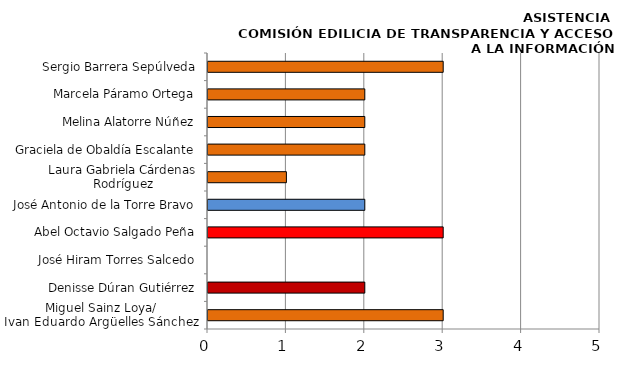
| Category | Series 0 |
|---|---|
| Miguel Sainz Loya/
Ivan Eduardo Argüelles Sánchez | 3 |
| Denisse Dúran Gutiérrez | 2 |
| José Hiram Torres Salcedo | 0 |
| Abel Octavio Salgado Peña | 3 |
| José Antonio de la Torre Bravo | 2 |
| Laura Gabriela Cárdenas Rodríguez | 1 |
| Graciela de Obaldía Escalante | 2 |
| Melina Alatorre Núñez | 2 |
| Marcela Páramo Ortega | 2 |
| Sergio Barrera Sepúlveda | 3 |